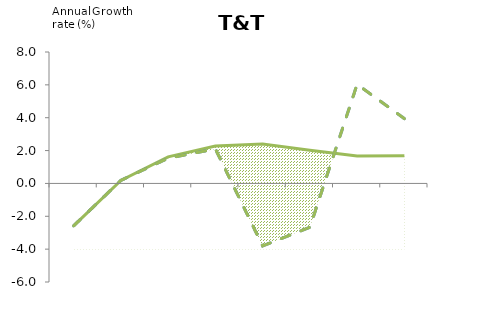
| Category | Series 1 | Series 4 |
|---|---|---|
| 0 | -2.581 | -2.581 |
| 1 | 0.184 | 0.184 |
| 2 | 1.617 | 1.535 |
| 3 | 2.281 | 2.099 |
| 4 | 2.397 | -3.805 |
| 5 | 2.025 | -2.669 |
| 6 | 1.67 | 6.032 |
| 7 | 1.686 | 3.945 |